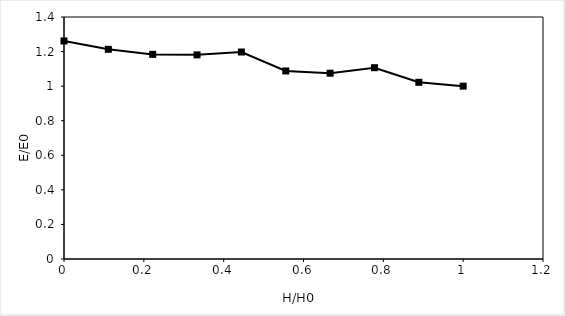
| Category | Head (feet) |
|---|---|
| 1.0 | 1 |
| 0.8888889411764708 | 1.022 |
| 0.7777778823529415 | 1.107 |
| 0.6666668235294123 | 1.075 |
| 0.555555764705883 | 1.088 |
| 0.44444470588235374 | 1.197 |
| 0.3333336470588245 | 1.181 |
| 0.22222258823529528 | 1.184 |
| 0.11111152941176602 | 1.213 |
| 0.0 | 1.261 |